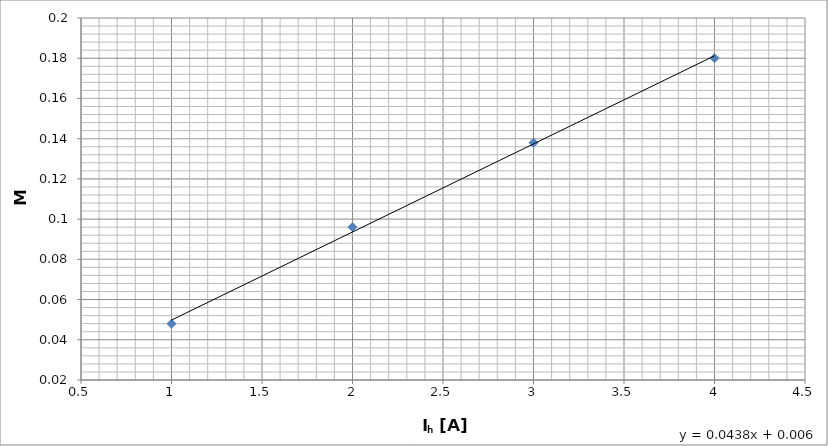
| Category | Series 0 |
|---|---|
| 1.0 | 0.048 |
| 2.0 | 0.096 |
| 3.0 | 0.138 |
| 4.0 | 0.18 |